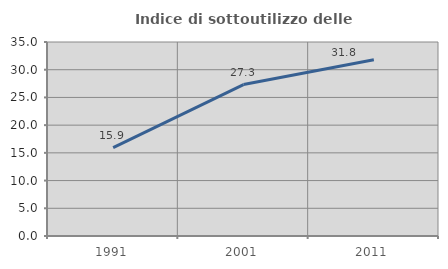
| Category | Indice di sottoutilizzo delle abitazioni  |
|---|---|
| 1991.0 | 15.927 |
| 2001.0 | 27.324 |
| 2011.0 | 31.804 |